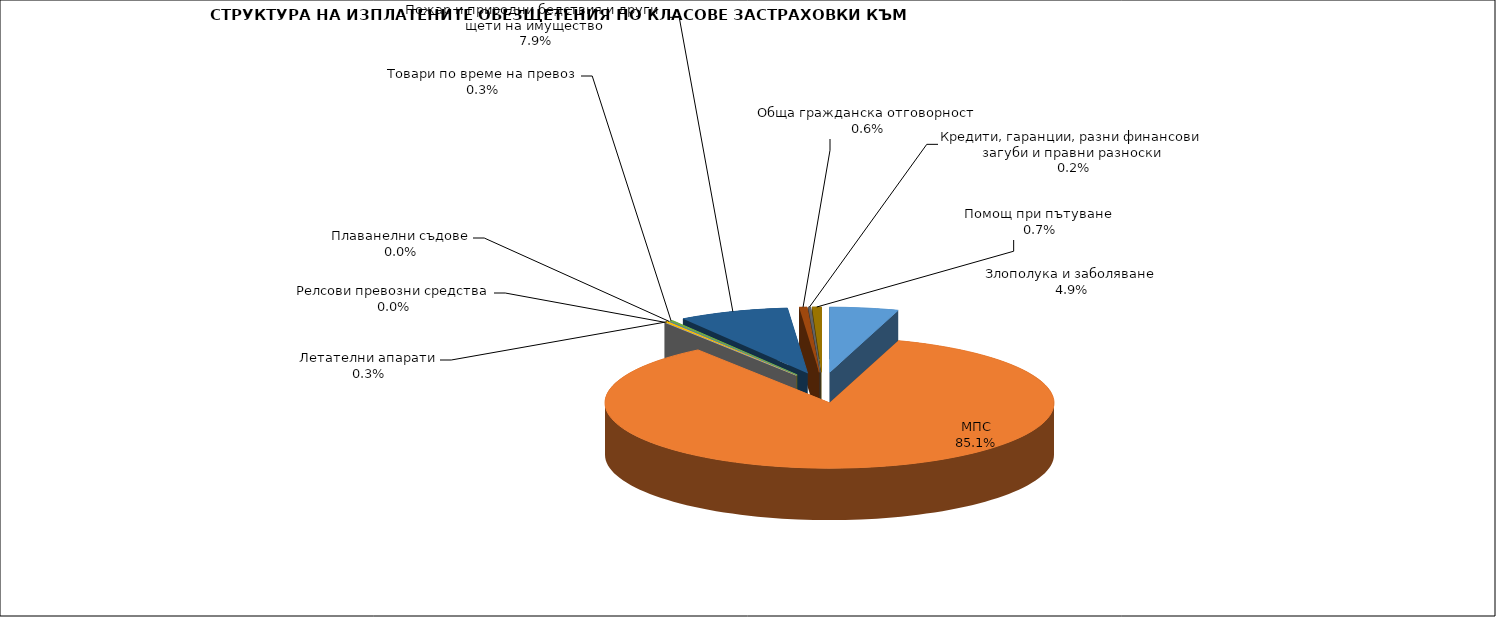
| Category | Series 0 |
|---|---|
| Злополука и заболяване | 0.049 |
| МПС | 0.851 |
| Релсови превозни средства | 0 |
| Летателни апарати | 0.003 |
| Плаванелни съдове | 0 |
| Товари по време на превоз | 0.003 |
| Пожар и природни бедствия и други щети на имущество | 0.079 |
| Обща гражданска отговорност | 0.006 |
| Кредити, гаранции, разни финансови загуби и правни разноски | 0.002 |
| Помощ при пътуване | 0.007 |